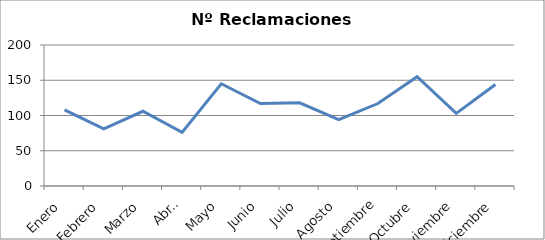
| Category | Nº Reclamaciones |
|---|---|
| Enero | 108 |
| Febrero | 81 |
| Marzo | 106 |
| Abril | 76 |
| Mayo | 145 |
| Junio | 117 |
| Julio | 118 |
| Agosto | 94 |
| Septiembre | 117 |
| Octubre | 155 |
| Noviembre | 103 |
| Diciembre | 144 |